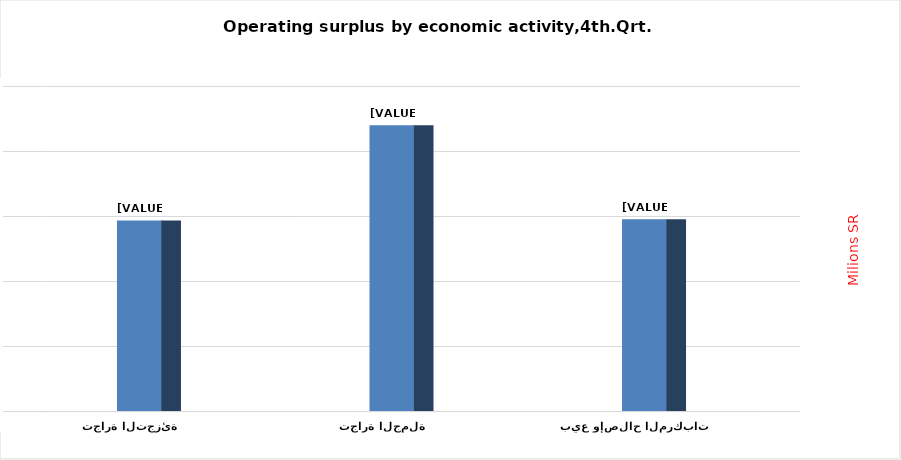
| Category | Series 0 |
|---|---|
| بيع وإصلاح المركبات  | 14745.954 |
| تجارة الجملة | 21977.854 |
| تجارة التجزئة | 14650.485 |